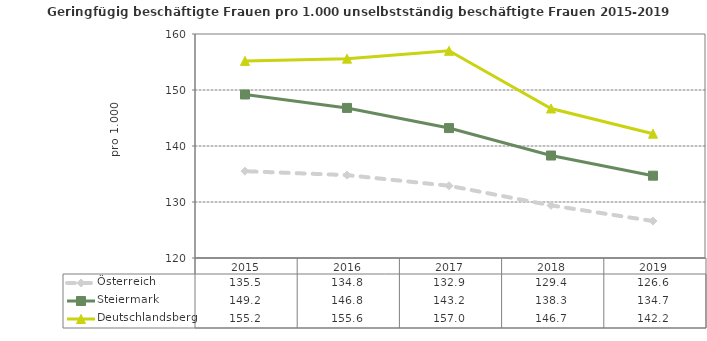
| Category | Österreich | Steiermark | Deutschlandsberg |
|---|---|---|---|
| 2019.0 | 126.6 | 134.7 | 142.2 |
| 2018.0 | 129.4 | 138.3 | 146.7 |
| 2017.0 | 132.9 | 143.2 | 157 |
| 2016.0 | 134.8 | 146.8 | 155.6 |
| 2015.0 | 135.5 | 149.2 | 155.2 |